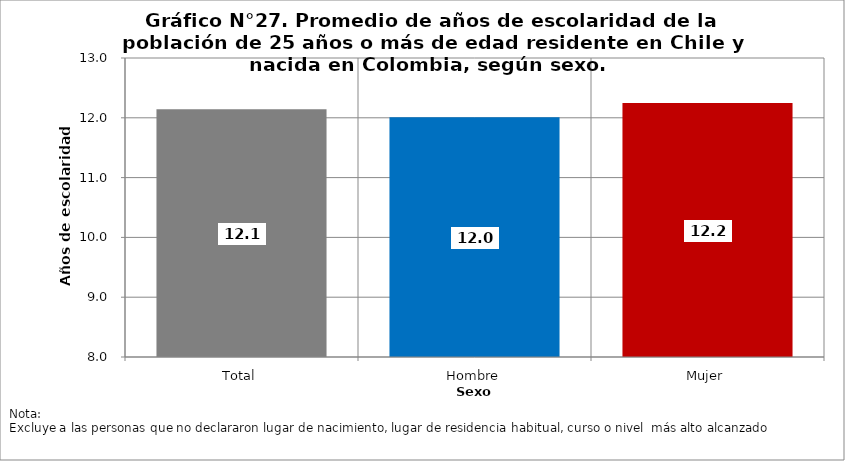
| Category | Series 0 |
|---|---|
| Total | 12.142 |
| Hombre | 12.008 |
| Mujer | 12.247 |